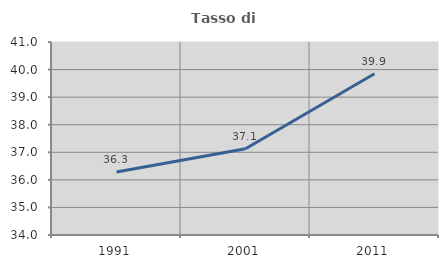
| Category | Tasso di occupazione   |
|---|---|
| 1991.0 | 36.283 |
| 2001.0 | 37.129 |
| 2011.0 | 39.851 |